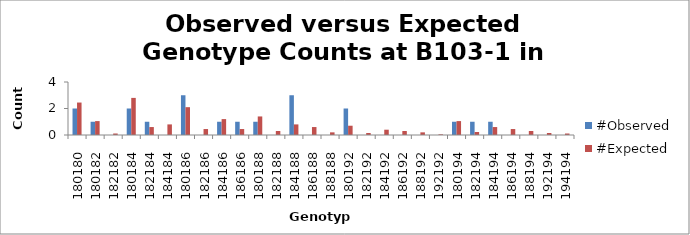
| Category | #Observed | #Expected |
|---|---|---|
| 180180.0 | 2 | 2.45 |
| 180182.0 | 1 | 1.05 |
| 182182.0 | 0 | 0.112 |
| 180184.0 | 2 | 2.8 |
| 182184.0 | 1 | 0.6 |
| 184184.0 | 0 | 0.8 |
| 180186.0 | 3 | 2.1 |
| 182186.0 | 0 | 0.45 |
| 184186.0 | 1 | 1.2 |
| 186186.0 | 1 | 0.45 |
| 180188.0 | 1 | 1.4 |
| 182188.0 | 0 | 0.3 |
| 184188.0 | 3 | 0.8 |
| 186188.0 | 0 | 0.6 |
| 188188.0 | 0 | 0.2 |
| 180192.0 | 2 | 0.7 |
| 182192.0 | 0 | 0.15 |
| 184192.0 | 0 | 0.4 |
| 186192.0 | 0 | 0.3 |
| 188192.0 | 0 | 0.2 |
| 192192.0 | 0 | 0.05 |
| 180194.0 | 1 | 1.05 |
| 182194.0 | 1 | 0.225 |
| 184194.0 | 1 | 0.6 |
| 186194.0 | 0 | 0.45 |
| 188194.0 | 0 | 0.3 |
| 192194.0 | 0 | 0.15 |
| 194194.0 | 0 | 0.112 |